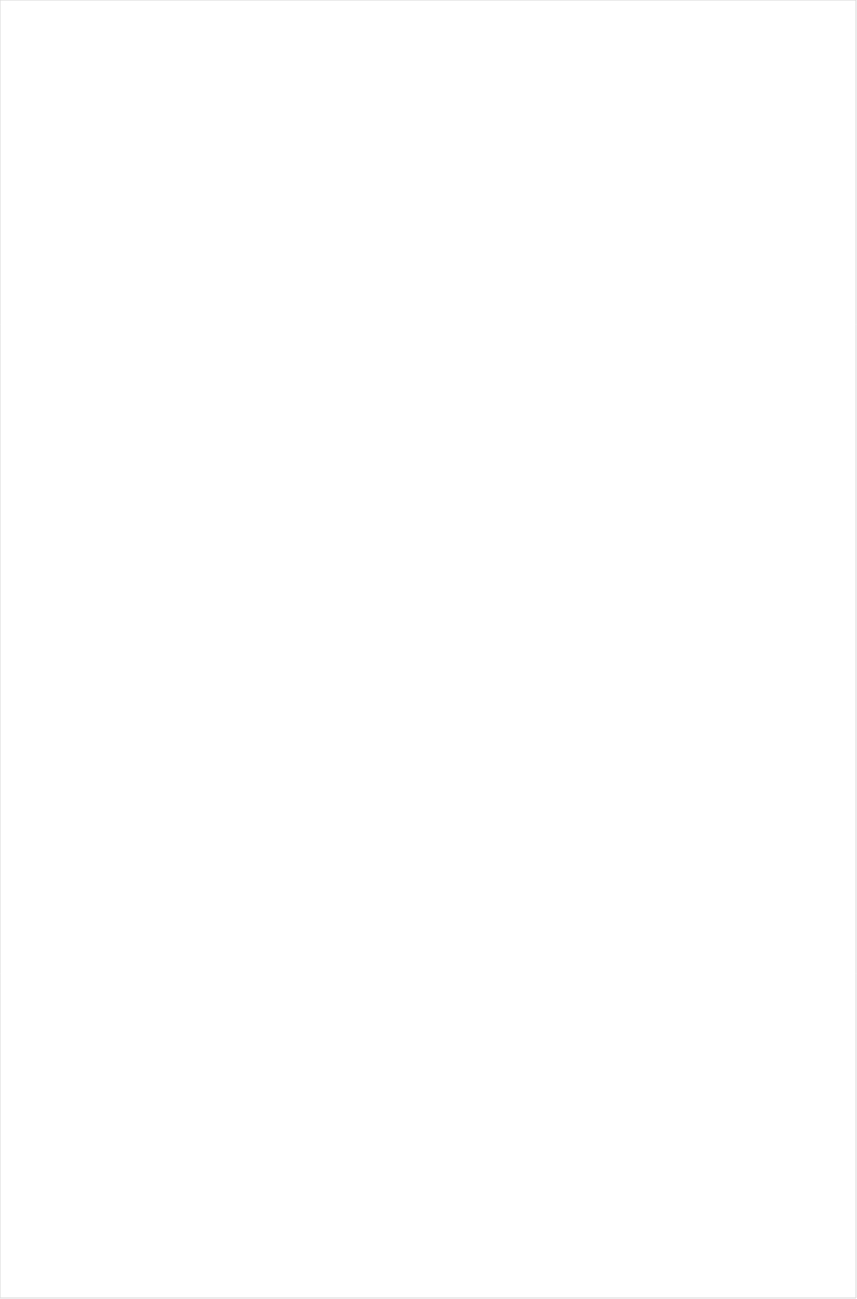
| Category | Total |
|---|---|
| RFD TV | -0.551 |
| Hallmark Movies & Mysteries | -0.544 |
| Telemundo | -0.516 |
| Hallmark | -0.499 |
| UniMas | -0.484 |
| Univision | -0.466 |
| MyNetworkTV | -0.465 |
| UP TV | -0.433 |
| Travel | -0.407 |
| Galavision | -0.398 |
| PBS | -0.343 |
| NBC Universo | -0.318 |
| Science Channel | -0.305 |
| Fox Business | -0.3 |
| Discovery Life Channel | -0.259 |
| Logo | -0.259 |
| Smithsonian | -0.246 |
| CMTV | -0.225 |
| Animal Planet | -0.209 |
| Great American Country | -0.18 |
| Investigation Discovery | -0.178 |
| WGN America | -0.175 |
| INSP | -0.166 |
| Weather Channel | -0.158 |
| Fox News | -0.142 |
| History Channel | -0.14 |
| POP | -0.139 |
| ION | -0.124 |
| TLC | -0.124 |
| DIY | -0.12 |
| CBS | -0.107 |
| Discovery Channel | -0.106 |
| HGTV | -0.08 |
| OXYGEN | -0.066 |
| TV LAND | -0.058 |
| Motor Trend Network | -0.047 |
| Discovery Family Channel | -0.042 |
| NBC | -0.038 |
| American Heroes Channel | -0.024 |
| E! | -0.019 |
| SundanceTV | -0.004 |
| Destination America | 0.006 |
| Nick@Nite | 0.013 |
| Outdoor Channel | 0.025 |
| FYI | 0.037 |
| Lifetime | 0.041 |
| BRAVO | 0.041 |
| Disney XD | 0.046 |
| CW | 0.047 |
| Headline News | 0.052 |
| ABC | 0.062 |
| National Geographic Wild | 0.068 |
| SYFY | 0.079 |
| Food Network | 0.081 |
| FOX | 0.09 |
| National Geographic | 0.101 |
| Cartoon Network | 0.102 |
| Freeform | 0.107 |
| Universal Kids | 0.107 |
| The Sportsman Channel | 0.118 |
| Disney Junior US | 0.129 |
| Lifetime Movies | 0.154 |
| A&E | 0.158 |
| Ovation | 0.159 |
| Nick Toons | 0.167 |
| TUDN | 0.176 |
| Reelz Channel | 0.178 |
| Nick | 0.179 |
| Disney Channel | 0.183 |
| Teen Nick | 0.195 |
| Adult Swim | 0.197 |
| WE TV | 0.202 |
| FXX | 0.209 |
| Independent Film (IFC) | 0.219 |
| AMC | 0.234 |
| FXDEP | 0.24 |
| Oprah Winfrey Network | 0.241 |
| Nick Jr. | 0.246 |
| BBC America | 0.257 |
| TBS | 0.257 |
| Bloomberg HD | 0.277 |
| Cooking Channel | 0.307 |
| Game Show | 0.307 |
| FX | 0.311 |
| FX Movie Channel | 0.318 |
| MTV | 0.341 |
| Paramount Network | 0.355 |
| USA Network | 0.41 |
| Fox Sports 1 | 0.411 |
| CNBC | 0.459 |
| Comedy Central | 0.501 |
| truTV | 0.523 |
| MSNBC | 0.541 |
| TNT | 0.542 |
| NHL | 0.58 |
| Olympic Channel | 0.599 |
| NBC Sports | 0.726 |
| CNN | 0.867 |
| MTV2 | 1.007 |
| Viceland | 1.045 |
| VH1 | 1.128 |
| FOX Sports 2 | 1.132 |
| Golf | 1.164 |
| BET | 1.261 |
| TV ONE | 1.326 |
| CBS Sports | 1.355 |
| ESPN Deportes | 1.405 |
| Big Ten Network | 1.448 |
| Tennis Channel | 1.543 |
| BET Her | 1.659 |
| MLB Network | 1.716 |
| ESPNU | 1.736 |
| PAC-12 Network | 2.233 |
| NFL Network | 2.488 |
| ESPNEWS | 2.874 |
| ESPN | 2.959 |
| ESPN2 | 3.036 |
| NBA TV | 6.465 |